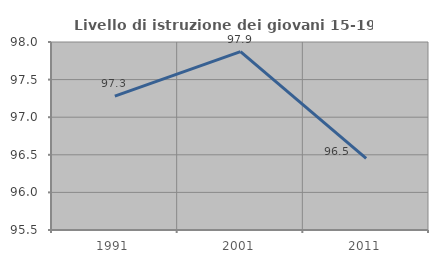
| Category | Livello di istruzione dei giovani 15-19 anni |
|---|---|
| 1991.0 | 97.28 |
| 2001.0 | 97.872 |
| 2011.0 | 96.452 |